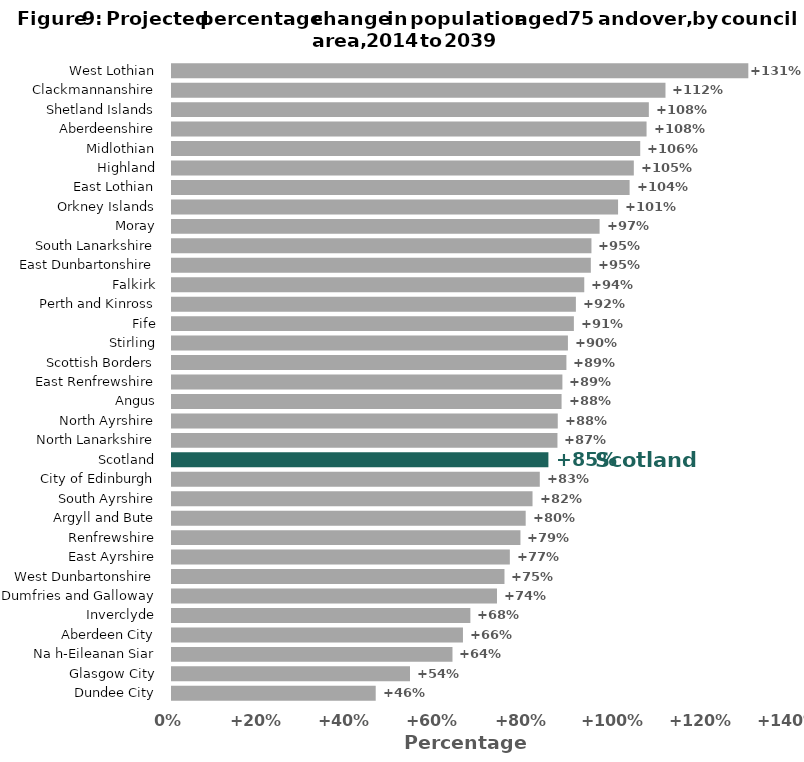
| Category | Series 0 |
|---|---|
| Dundee City | 46.223 |
| Glasgow City | 54.004 |
| Na h-Eileanan Siar | 63.643 |
| Aberdeen City | 66.017 |
| Inverclyde | 67.7 |
| Dumfries and Galloway | 73.74 |
| West Dunbartonshire | 75.44 |
| East Ayrshire | 76.657 |
| Renfrewshire | 79.062 |
| Argyll and Bute | 80.253 |
| South Ayrshire | 81.804 |
| City of Edinburgh | 83.45 |
| Scotland | 85.407 |
| North Lanarkshire | 87.462 |
| North Ayrshire | 87.533 |
| Angus | 88.398 |
| East Renfrewshire | 88.586 |
| Scottish Borders | 89.497 |
| Stirling | 89.836 |
| Fife | 91.188 |
| Perth and Kinross | 91.642 |
| Falkirk | 93.544 |
| East Dunbartonshire | 95.034 |
| South Lanarkshire | 95.172 |
| Moray | 97.028 |
| Orkney Islands | 101.214 |
| East Lothian | 103.83 |
| Highland | 104.789 |
| Midlothian | 106.244 |
| Aberdeenshire | 107.679 |
| Shetland Islands | 108.197 |
| Clackmannanshire | 111.974 |
| West Lothian | 130.772 |